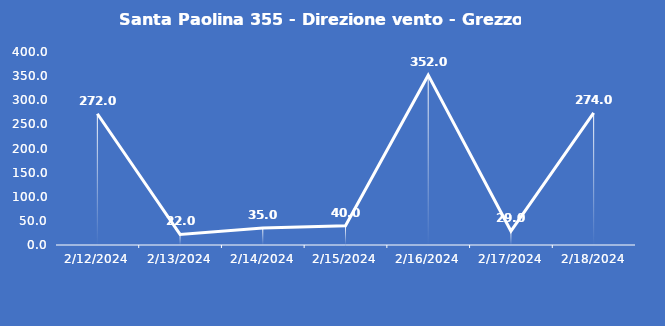
| Category | Santa Paolina 355 - Direzione vento - Grezzo (°N) |
|---|---|
| 2/12/24 | 272 |
| 2/13/24 | 22 |
| 2/14/24 | 35 |
| 2/15/24 | 40 |
| 2/16/24 | 352 |
| 2/17/24 | 29 |
| 2/18/24 | 274 |